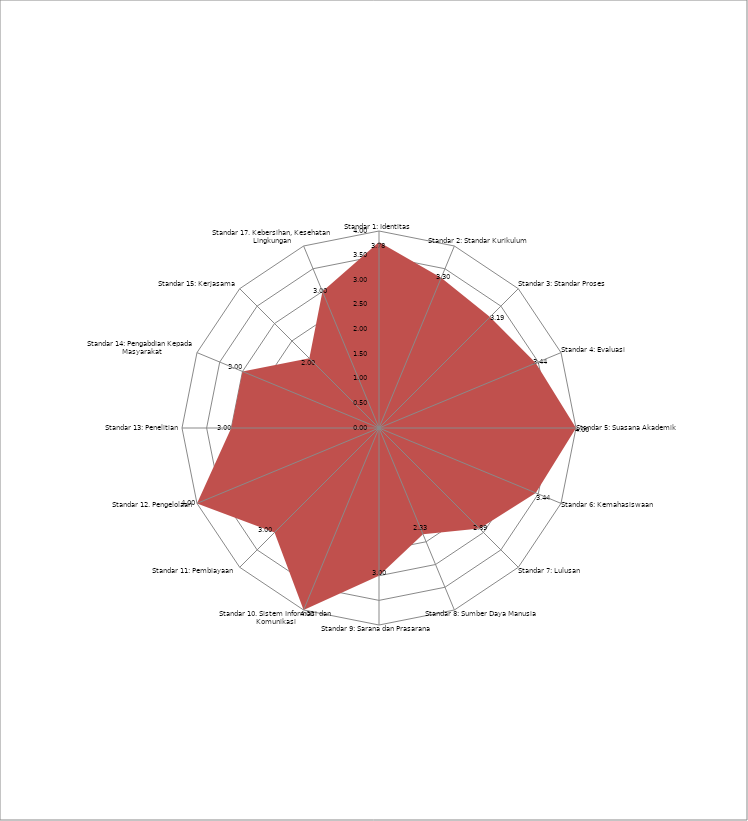
| Category | Nilai per standar |
|---|---|
| Standar 1: Identitas | 3.778 |
| Standar 2: Standar Kurikulum | 3.3 |
| Standar 3: Standar Proses | 3.188 |
| Standar 4: Evaluasi | 3.444 |
| Standar 5: Suasana Akademik | 4 |
| Standar 6: Kemahasiswaan | 3.444 |
| Standar 7: Lulusan  | 2.889 |
| Standar 8: Sumber Daya Manusia | 2.333 |
| Standar 9: Sarana dan Prasarana  | 3 |
| Standar 10. Sistem Informasi dan Komunikasi | 4 |
| Standar 11: Pembiayaan  | 3 |
| Standar 12. Pengelolaan | 4 |
| Standar 13: Penelitian | 3 |
| Standar 14: Pengabdian Kepada Masyarakat | 3 |
| Standar 15: Kerjasama  | 2 |
| Standar 17. Kebersihan, Kesehatan  Lingkungan | 3 |